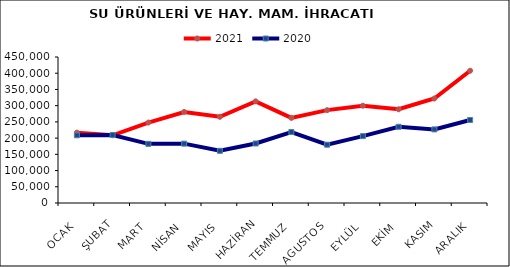
| Category | 2021 | 2020 |
|---|---|---|
| OCAK | 216896.184 | 208704.155 |
| ŞUBAT | 208723.363 | 209590.385 |
| MART | 247882.115 | 182293.106 |
| NİSAN | 280588.888 | 182916.507 |
| MAYIS | 265663.39 | 160819.648 |
| HAZİRAN | 313347.256 | 183353.037 |
| TEMMUZ | 262350.031 | 218769.256 |
| AGUSTOS | 286221.948 | 179649.281 |
| EYLÜL | 299819.843 | 206141.398 |
| EKİM | 288878.577 | 234850.01 |
| KASIM | 322132.701 | 226835.073 |
| ARALIK | 407649.375 | 255890.403 |